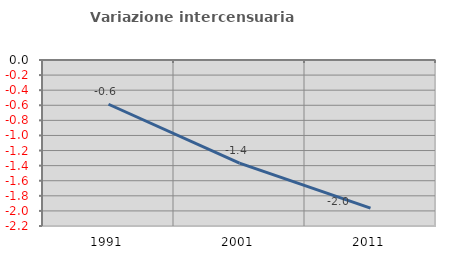
| Category | Variazione intercensuaria annua |
|---|---|
| 1991.0 | -0.586 |
| 2001.0 | -1.366 |
| 2011.0 | -1.964 |